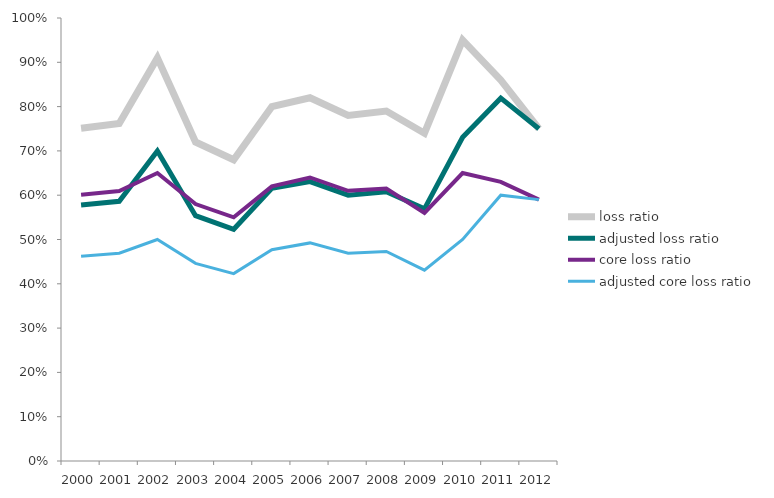
| Category | loss ratio | adjusted loss ratio | core loss ratio | adjusted core loss ratio |
|---|---|---|---|---|
| 2000.0 | 0.751 | 0.578 | 0.601 | 0.462 |
| 2001.0 | 0.762 | 0.586 | 0.61 | 0.469 |
| 2002.0 | 0.91 | 0.7 | 0.65 | 0.5 |
| 2003.0 | 0.72 | 0.554 | 0.58 | 0.446 |
| 2004.0 | 0.68 | 0.523 | 0.55 | 0.423 |
| 2005.0 | 0.8 | 0.615 | 0.62 | 0.477 |
| 2006.0 | 0.82 | 0.631 | 0.64 | 0.492 |
| 2007.0 | 0.78 | 0.6 | 0.61 | 0.469 |
| 2008.0 | 0.79 | 0.608 | 0.615 | 0.473 |
| 2009.0 | 0.74 | 0.569 | 0.56 | 0.431 |
| 2010.0 | 0.95 | 0.731 | 0.65 | 0.5 |
| 2011.0 | 0.86 | 0.819 | 0.63 | 0.6 |
| 2012.0 | 0.75 | 0.75 | 0.59 | 0.59 |